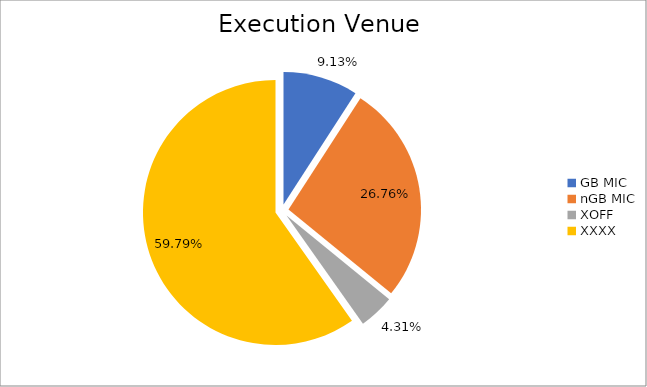
| Category | Series 0 |
|---|---|
| GB MIC | 895113.73 |
| nGB MIC | 2622419.825 |
| XOFF | 422707.808 |
| XXXX | 5859111.768 |